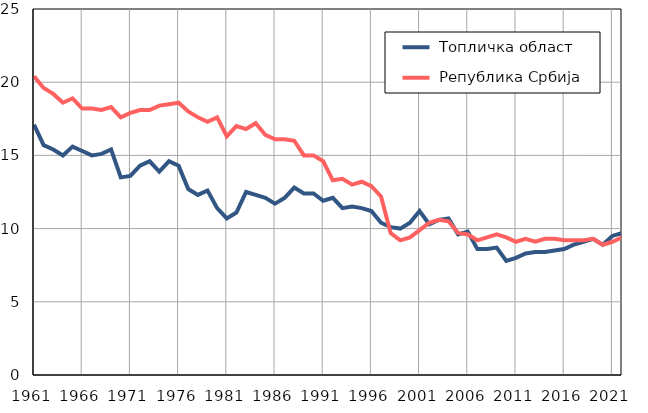
| Category |  Топличка област |  Република Србија |
|---|---|---|
| 1961.0 | 17.1 | 20.4 |
| 1962.0 | 15.7 | 19.6 |
| 1963.0 | 15.4 | 19.2 |
| 1964.0 | 15 | 18.6 |
| 1965.0 | 15.6 | 18.9 |
| 1966.0 | 15.3 | 18.2 |
| 1967.0 | 15 | 18.2 |
| 1968.0 | 15.1 | 18.1 |
| 1969.0 | 15.4 | 18.3 |
| 1970.0 | 13.5 | 17.6 |
| 1971.0 | 13.6 | 17.9 |
| 1972.0 | 14.3 | 18.1 |
| 1973.0 | 14.6 | 18.1 |
| 1974.0 | 13.9 | 18.4 |
| 1975.0 | 14.6 | 18.5 |
| 1976.0 | 14.3 | 18.6 |
| 1977.0 | 12.7 | 18 |
| 1978.0 | 12.3 | 17.6 |
| 1979.0 | 12.6 | 17.3 |
| 1980.0 | 11.4 | 17.6 |
| 1981.0 | 10.7 | 16.3 |
| 1982.0 | 11.1 | 17 |
| 1983.0 | 12.5 | 16.8 |
| 1984.0 | 12.3 | 17.2 |
| 1985.0 | 12.1 | 16.4 |
| 1986.0 | 11.7 | 16.1 |
| 1987.0 | 12.1 | 16.1 |
| 1988.0 | 12.8 | 16 |
| 1989.0 | 12.4 | 15 |
| 1990.0 | 12.4 | 15 |
| 1991.0 | 11.9 | 14.6 |
| 1992.0 | 12.1 | 13.3 |
| 1993.0 | 11.4 | 13.4 |
| 1994.0 | 11.5 | 13 |
| 1995.0 | 11.4 | 13.2 |
| 1996.0 | 11.2 | 12.9 |
| 1997.0 | 10.4 | 12.2 |
| 1998.0 | 10.1 | 9.7 |
| 1999.0 | 10 | 9.2 |
| 2000.0 | 10.4 | 9.4 |
| 2001.0 | 11.2 | 9.9 |
| 2002.0 | 10.3 | 10.4 |
| 2003.0 | 10.6 | 10.6 |
| 2004.0 | 10.7 | 10.5 |
| 2005.0 | 9.6 | 9.7 |
| 2006.0 | 9.8 | 9.6 |
| 2007.0 | 8.6 | 9.2 |
| 2008.0 | 8.6 | 9.4 |
| 2009.0 | 8.7 | 9.6 |
| 2010.0 | 7.8 | 9.4 |
| 2011.0 | 8 | 9.1 |
| 2012.0 | 8.3 | 9.3 |
| 2013.0 | 8.4 | 9.1 |
| 2014.0 | 8.4 | 9.3 |
| 2015.0 | 8.5 | 9.3 |
| 2016.0 | 8.6 | 9.2 |
| 2017.0 | 8.9 | 9.2 |
| 2018.0 | 9.1 | 9.2 |
| 2019.0 | 9.3 | 9.3 |
| 2020.0 | 8.9 | 8.9 |
| 2021.0 | 9.5 | 9.1 |
| 2022.0 | 9.7 | 9.4 |